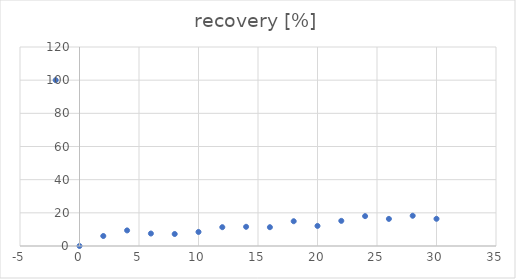
| Category | recovery [%] |
|---|---|
| -2.0 | 100 |
| 0.0 | 0 |
| 2.0 | 6.024 |
| 4.0 | 9.402 |
| 6.0 | 7.524 |
| 8.0 | 7.228 |
| 10.0 | 8.472 |
| 12.0 | 11.344 |
| 14.0 | 11.584 |
| 16.0 | 11.335 |
| 18.0 | 14.937 |
| 20.0 | 12.106 |
| 22.0 | 15.159 |
| 24.0 | 18.013 |
| 26.0 | 16.345 |
| 28.0 | 18.237 |
| 30.0 | 16.403 |